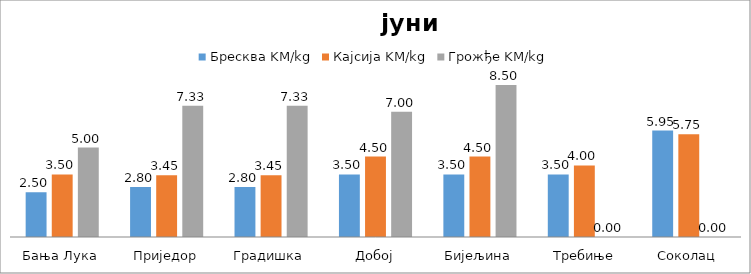
| Category | Бресква KM/kg | Кајсија KM/kg | Грожђе KM/kg |
|---|---|---|---|
| Бања Лука | 2.5 | 3.5 | 5 |
| Приједор | 2.8 | 3.45 | 7.333 |
| Градишка | 2.8 | 3.45 | 7.333 |
| Добој | 3.5 | 4.5 | 7 |
| Бијељина | 3.5 | 4.5 | 8.5 |
|  Требиње | 3.5 | 4 | 0 |
| Соколац | 5.95 | 5.75 | 0 |